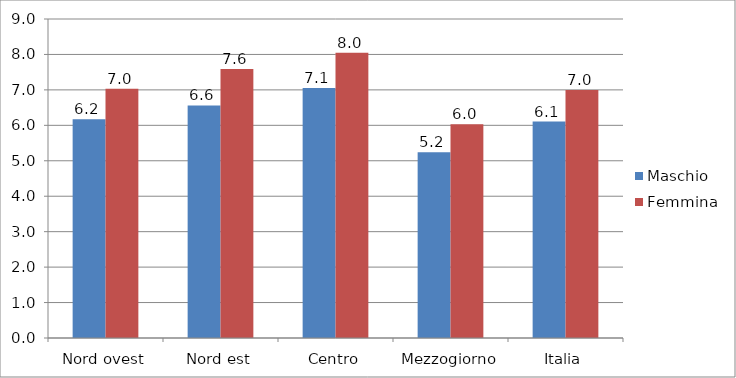
| Category | Maschio | Femmina |
|---|---|---|
| Nord ovest | 6.171 | 7.032 |
| Nord est | 6.56 | 7.592 |
| Centro | 7.053 | 8.049 |
| Mezzogiorno | 5.242 | 6.03 |
| Italia | 6.106 | 6.997 |